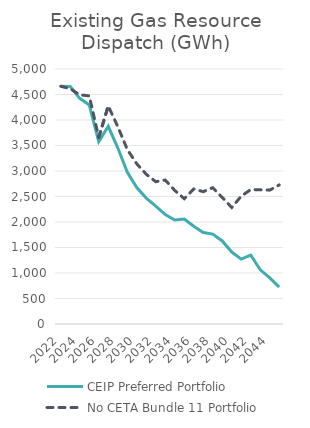
| Category | CEIP Preferred Portfolio | No CETA Bundle 11 Portfolio |
|---|---|---|
| 2022.0 | 4660.646 | 4661.619 |
| 2023.0 | 4657.102 | 4612.385 |
| 2024.0 | 4424.918 | 4493.409 |
| 2025.0 | 4295.606 | 4473.536 |
| 2026.0 | 3573.424 | 3659.132 |
| 2027.0 | 3876.658 | 4275.454 |
| 2028.0 | 3454.471 | 3871.794 |
| 2029.0 | 2979.715 | 3424.392 |
| 2030.0 | 2675.784 | 3140.824 |
| 2031.0 | 2469.082 | 2936.095 |
| 2032.0 | 2313.126 | 2790.752 |
| 2033.0 | 2145.035 | 2822.415 |
| 2034.0 | 2040.25 | 2618.892 |
| 2035.0 | 2059.754 | 2456.71 |
| 2036.0 | 1915.677 | 2648.22 |
| 2037.0 | 1793.037 | 2594.779 |
| 2038.0 | 1762.685 | 2672.833 |
| 2039.0 | 1629.109 | 2481.751 |
| 2040.0 | 1411.143 | 2283.745 |
| 2041.0 | 1272.93 | 2507.566 |
| 2042.0 | 1352.558 | 2635.342 |
| 2043.0 | 1063.456 | 2630.748 |
| 2044.0 | 902.595 | 2624.806 |
| 2045.0 | 721.576 | 2727.497 |